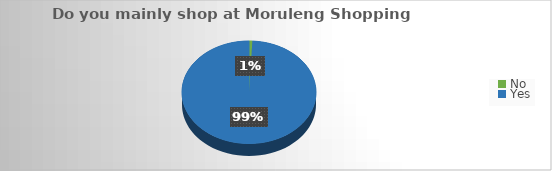
| Category | Series 0 |
|---|---|
| No | 0.008 |
| Yes | 0.992 |